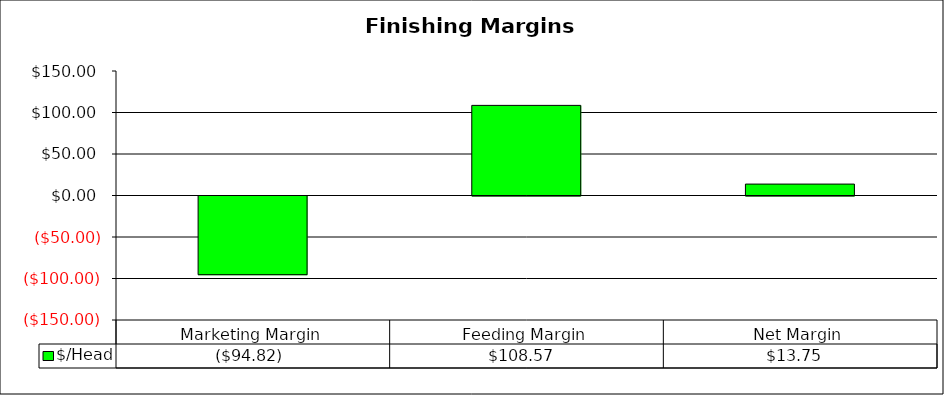
| Category | $/Head |
|---|---|
| Marketing Margin | -94.819 |
| Feeding Margin | 108.566 |
| Net Margin | 13.747 |